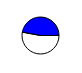
| Category | Series 0 |
|---|---|
| 0 | 36822 |
| 1 | 32768 |